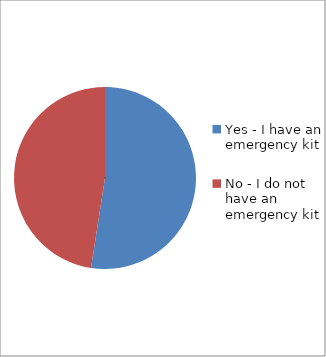
| Category | Series 0 |
|---|---|
| Yes - I have an emergency kit | 0.525 |
| No - I do not have an emergency kit | 0.475 |